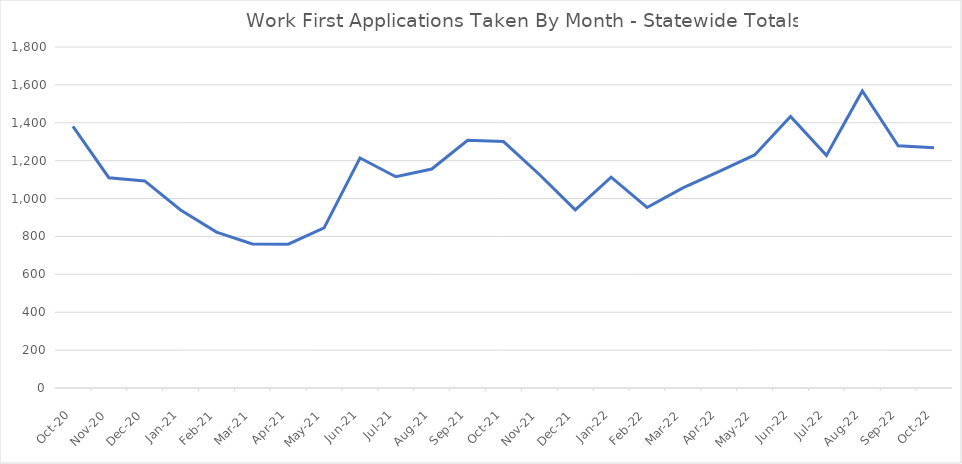
| Category | Series 0 |
|---|---|
| 2022-10-22 | 1268 |
| 2022-09-22 | 1279 |
| 2022-08-22 | 1568 |
| 2022-07-22 | 1228 |
| 2022-06-01 | 1433 |
| 2022-05-01 | 1230 |
| 2022-04-01 | 1142 |
| 2022-03-01 | 1056 |
| 2022-02-01 | 953 |
| 2022-01-01 | 1113 |
| 2021-12-02 | 940 |
| 2021-11-01 | 1127 |
| 2021-10-01 | 1301 |
| 2021-09-01 | 1308 |
| 2021-08-01 | 1156 |
| 2021-07-01 | 1115 |
| 2021-06-01 | 1214 |
| 2021-05-01 | 845 |
| 2021-04-01 | 759 |
| 2021-03-01 | 760 |
| 2021-02-01 | 823 |
| 2021-01-01 | 940 |
| 2020-12-01 | 1093 |
| 2020-11-01 | 1110 |
| 2020-10-01 | 1381 |